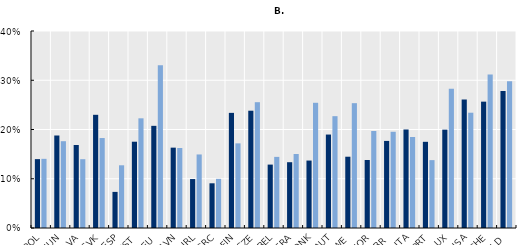
| Category | 1990s | 2010s |
|---|---|---|
| POL | 0.14 | 0.14 |
| HUN | 0.188 | 0.176 |
| LVA | 0.169 | 0.14 |
| SVK | 0.23 | 0.183 |
| ESP | 0.073 | 0.127 |
| EST | 0.175 | 0.223 |
| DEU | 0.207 | 0.33 |
| SVN | 0.163 | 0.162 |
| IRL | 0.099 | 0.149 |
| GRC | 0.091 | 0.1 |
| FIN | 0.234 | 0.172 |
| CZE | 0.238 | 0.255 |
| BEL | 0.129 | 0.144 |
| FRA | 0.134 | 0.15 |
| DNK | 0.137 | 0.254 |
| AUT | 0.19 | 0.227 |
| SWE | 0.145 | 0.253 |
| NOR | 0.138 | 0.197 |
| GBR | 0.177 | 0.195 |
| ITA | 0.2 | 0.185 |
| PRT | 0.175 | 0.138 |
| LUX | 0.2 | 0.283 |
| USA | 0.261 | 0.234 |
| CHE | 0.257 | 0.312 |
| NLD | 0.278 | 0.298 |